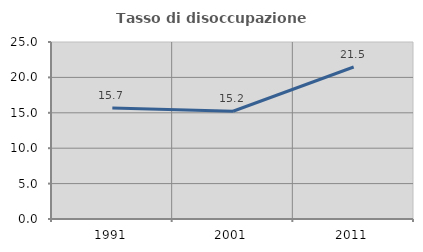
| Category | Tasso di disoccupazione giovanile  |
|---|---|
| 1991.0 | 15.67 |
| 2001.0 | 15.217 |
| 2011.0 | 21.472 |